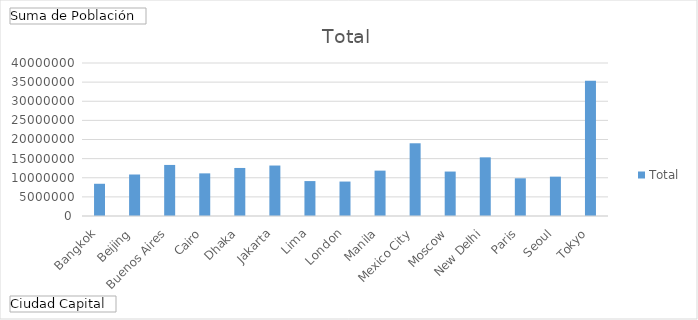
| Category | Total |
|---|---|
| Bangkok | 8426000 |
| Beijing | 10849000 |
| Buenos Aires | 13349000 |
| Cairo | 11146000 |
| Dhaka | 12560000 |
| Jakarta | 13194000 |
| Lima | 9130000 |
| London | 9005000 |
| Manila | 11862000 |
| Mexico City | 19013000 |
| Moscow | 11621000 |
| New Delhi | 15334000 |
| Paris | 9854000 |
| Seoul | 10287847 |
| Tokyo | 35327000 |